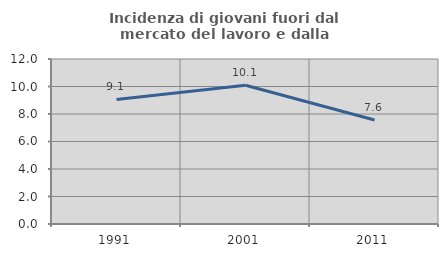
| Category | Incidenza di giovani fuori dal mercato del lavoro e dalla formazione  |
|---|---|
| 1991.0 | 9.059 |
| 2001.0 | 10.095 |
| 2011.0 | 7.562 |